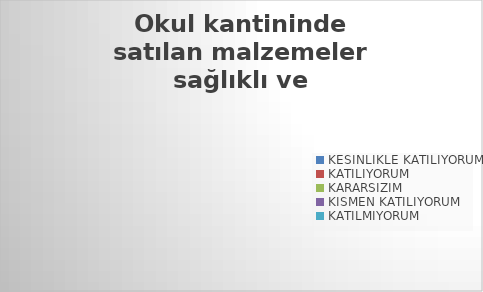
| Category | Okul kantininde satılan malzemeler sağlıklı ve güvenlidir. |
|---|---|
| KESİNLİKLE KATILIYORUM | 0 |
| KATILIYORUM | 0 |
| KARARSIZIM | 0 |
| KISMEN KATILIYORUM | 0 |
| KATILMIYORUM | 0 |